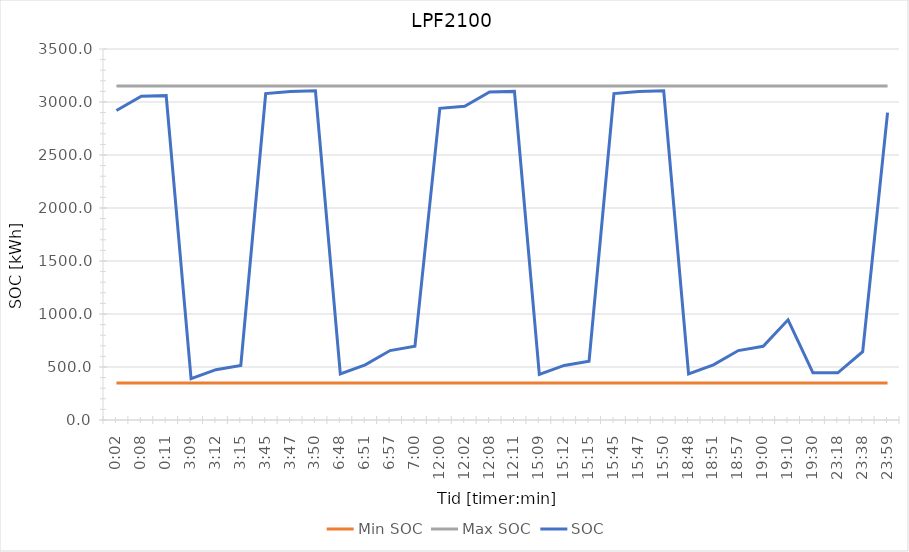
| Category | Min SOC | Max SOC | SOC |
|---|---|---|---|
| 0.001388888888888889 | 350 | 3150 | 2920 |
| 0.005555555555555556 | 350 | 3150 | 3055 |
| 0.007638888888888889 | 350 | 3150 | 3060 |
| 0.13125 | 350 | 3150 | 390 |
| 0.13333333333333333 | 350 | 3150 | 475 |
| 0.13541666666666666 | 350 | 3150 | 515 |
| 0.15625 | 350 | 3150 | 3080 |
| 0.15763888888888888 | 350 | 3150 | 3100 |
| 0.15972222222222224 | 350 | 3150 | 3105 |
| 0.2833333333333333 | 350 | 3150 | 435 |
| 0.28541666666666665 | 350 | 3150 | 520 |
| 0.28958333333333336 | 350 | 3150 | 655 |
| 0.2916666666666667 | 350 | 3150 | 695 |
| 0.5 | 350 | 3150 | 2940 |
| 0.5013888888888889 | 350 | 3150 | 2960 |
| 0.5055555555555555 | 350 | 3150 | 3095 |
| 0.5076388888888889 | 350 | 3150 | 3100 |
| 0.63125 | 350 | 3150 | 430 |
| 0.6333333333333333 | 350 | 3150 | 515 |
| 0.6354166666666666 | 350 | 3150 | 555 |
| 0.65625 | 350 | 3150 | 3080 |
| 0.6576388888888889 | 350 | 3150 | 3100 |
| 0.6597222222222222 | 350 | 3150 | 3105 |
| 0.7833333333333333 | 350 | 3150 | 435 |
| 0.7854166666666668 | 350 | 3150 | 520 |
| 0.7895833333333333 | 350 | 3150 | 655 |
| 0.7916666666666666 | 350 | 3150 | 695 |
| 0.7986111111111112 | 350 | 3150 | 945 |
| 0.8125 | 350 | 3150 | 445 |
| 0.9708333333333333 | 350 | 3150 | 445 |
| 0.9847222222222222 | 350 | 3150 | 645 |
| 0.9993055555555556 | 350 | 3150 | 2900 |